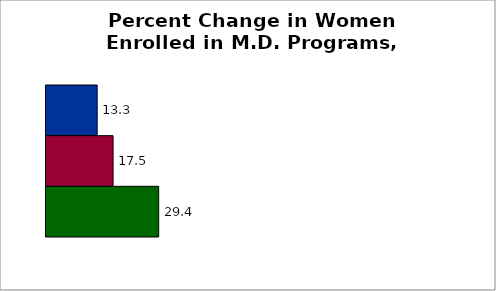
| Category | 50 states and D.C. | SREB states | State |
|---|---|---|---|
| 0 | 13.334 | 17.479 | 29.362 |